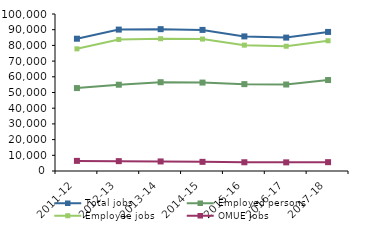
| Category | Total jobs | Employed persons | Employee jobs | OMUE jobs |
|---|---|---|---|---|
| 2011-12 | 84265 | 52819 | 77818 | 6447 |
| 2012-13 | 90066 | 54947 | 83785 | 6279 |
| 2013-14 | 90339 | 56546 | 84256 | 6085 |
| 2014-15 | 89870 | 56318 | 84045 | 5828 |
| 2015-16 | 85735 | 55328 | 80166 | 5568 |
| 2016-17 | 84967 | 55091 | 79465 | 5502 |
| 2017-18 | 88583 | 57940 | 82957 | 5628 |